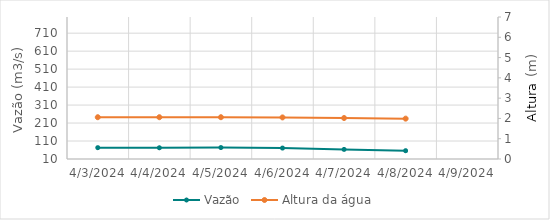
| Category | Vazão |
|---|---|
| 10/30/23 | 20.03 |
| 10/29/23 | 21.22 |
| 10/28/23 | 22.73 |
| 10/27/23 | 23.57 |
| 10/26/23 | 25.04 |
| 10/25/23 | 25.13 |
| 10/24/23 | 23.94 |